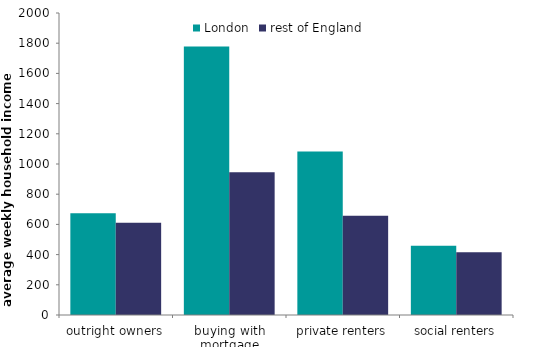
| Category | London | rest of England |
|---|---|---|
| outright owners | 673.034 | 611.737 |
| buying with mortgage | 1778.285 | 944.546 |
| private renters | 1083.448 | 656.78 |
| social renters | 458.599 | 416.244 |